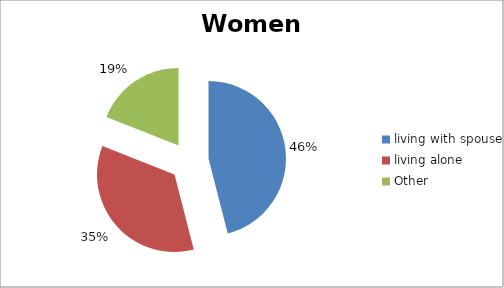
| Category | Women |
|---|---|
| living with spouse | 0.46 |
| living alone  | 0.35 |
| Other | 0.19 |